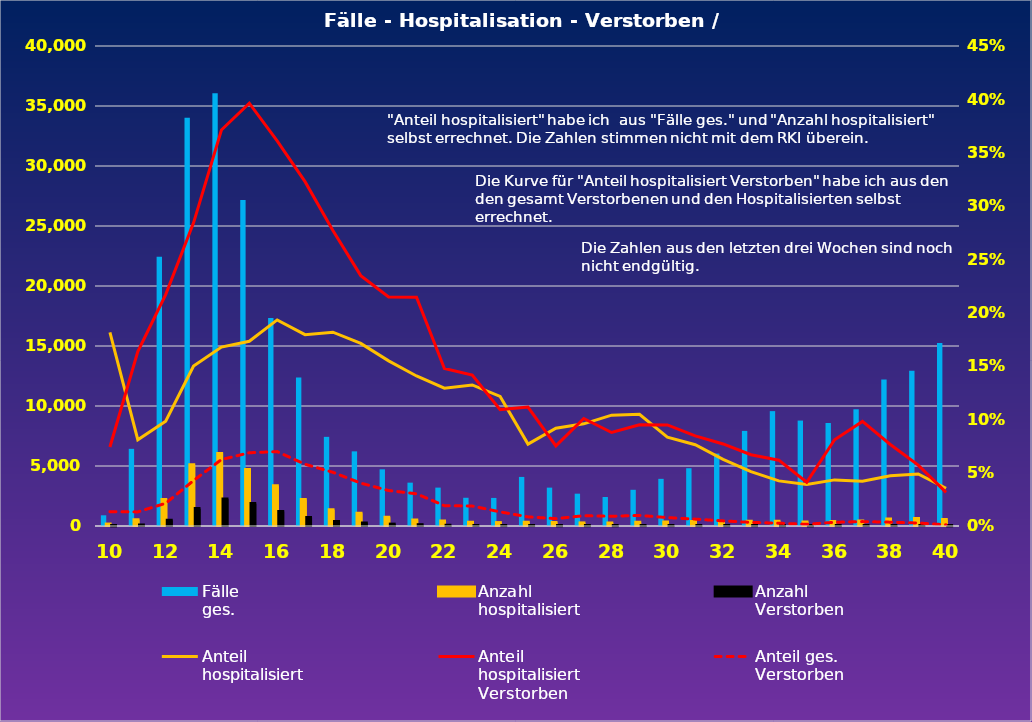
| Category | Fälle
ges. | Anzahl
hospitalisiert | Anzahl
Verstorben |
|---|---|---|---|
| 10.0 | 892 | 162 | 12 |
| 11.0 | 6430 | 520 | 85 |
| 12.0 | 22430 | 2203 | 478 |
| 13.0 | 34019 | 5099 | 1449 |
| 14.0 | 36068 | 6049 | 2246 |
| 15.0 | 27163 | 4705 | 1865 |
| 16.0 | 17334 | 3349 | 1209 |
| 17.0 | 12367 | 2218 | 716 |
| 18.0 | 7429 | 1350 | 374 |
| 19.0 | 6220 | 1065 | 250 |
| 20.0 | 4722 | 731 | 157 |
| 21.0 | 3612 | 508 | 109 |
| 22.0 | 3198 | 413 | 61 |
| 23.0 | 2352 | 311 | 44 |
| 24.0 | 2339 | 284 | 31 |
| 25.0 | 4089 | 314 | 35 |
| 26.0 | 3197 | 293 | 22 |
| 27.0 | 2693 | 258 | 26 |
| 28.0 | 2415 | 251 | 22 |
| 29.0 | 3017 | 316 | 30 |
| 30.0 | 3929 | 327 | 31 |
| 31.0 | 4814 | 367 | 31 |
| 32.0 | 6035 | 377 | 29 |
| 33.0 | 7925 | 404 | 27 |
| 34.0 | 9572 | 405 | 25 |
| 35.0 | 8786 | 341 | 14 |
| 36.0 | 8582 | 371 | 30 |
| 37.0 | 9726 | 408 | 40 |
| 38.0 | 12217 | 576 | 44 |
| 39.0 | 12940 | 631 | 36 |
| 40.0 | 15241 | 539 | 17 |